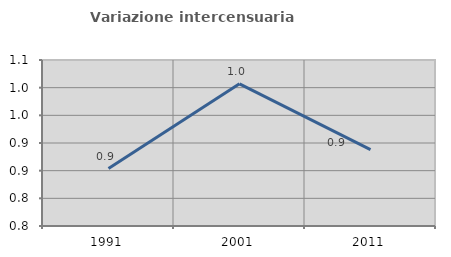
| Category | Variazione intercensuaria annua |
|---|---|
| 1991.0 | 0.854 |
| 2001.0 | 1.007 |
| 2011.0 | 0.888 |